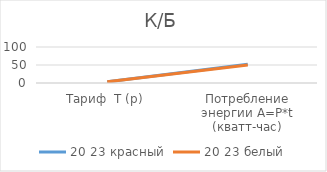
| Category | 20 |
|---|---|
| Тариф  Т (р) | 3.3 |
| Потребление энергии A=P*t (кватт-час) | 50 |